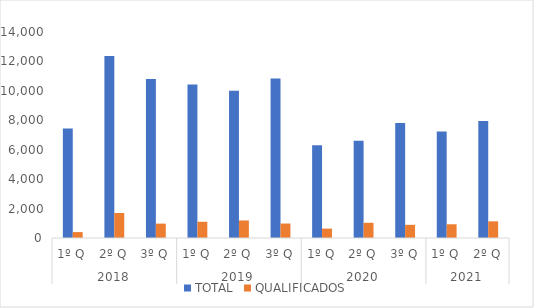
| Category | TOTAL | QUALIFICADOS |
|---|---|---|
| 0 | 7443 | 402 |
| 1 | 12365 | 1701 |
| 2 | 10811 | 977 |
| 3 | 10439 | 1104 |
| 4 | 10013 | 1192 |
| 5 | 10845 | 984 |
| 6 | 6295 | 637 |
| 7 | 6612 | 1032 |
| 8 | 7823 | 895 |
| 9 | 7242 | 933 |
| 10 | 7949 | 1133 |